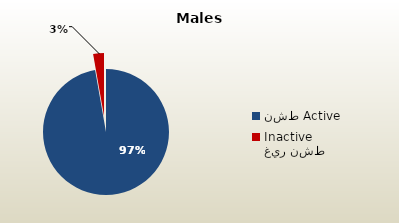
| Category | الذكور غير القطريين  Non-Qatari Males |
|---|---|
| نشط Active | 1701076 |
| غير نشط Inactive | 48429 |